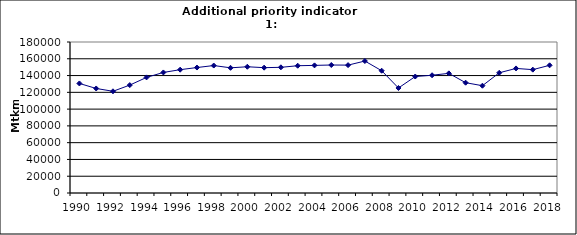
| Category | Freight transport on road, Mtkm |
|---|---|
| 1990 | 130600 |
| 1991 | 124592 |
| 1992 | 121250 |
| 1993 | 128625 |
| 1994 | 137811 |
| 1995 | 143700 |
| 1996 | 147000 |
| 1997 | 149557 |
| 1998 | 151931 |
| 1999 | 149225 |
| 2000 | 150482 |
| 2001 | 149398 |
| 2002 | 149826 |
| 2003 | 151711 |
| 2004 | 152126 |
| 2005 | 152566 |
| 2006 | 152445 |
| 2007 | 157311 |
| 2008 | 145760 |
| 2009 | 125177 |
| 2010 | 138850 |
| 2011 | 140366 |
| 2012 | 142625 |
| 2013 | 131493 |
| 2014 | 127885 |
| 2015 | 143294 |
| 2016 | 148494 |
| 2017 | 147049.432 |
| 2018 | 152200 |